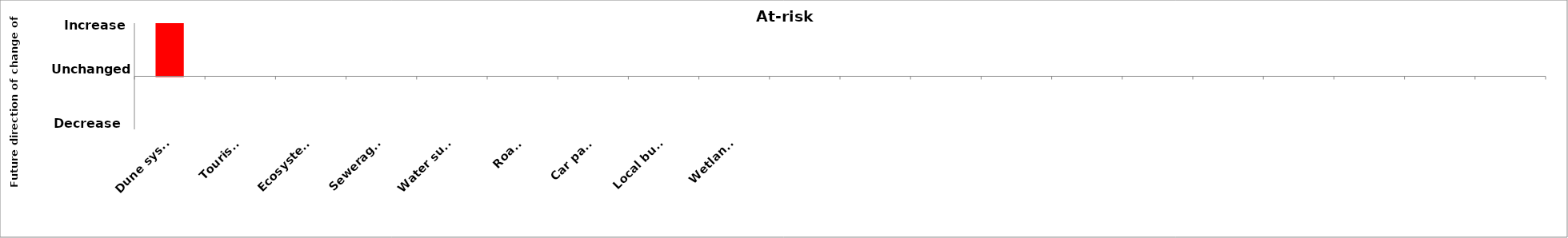
| Category | Future Direction |
|---|---|
| Dune system of X beach | 1 |
| Tourism  | 0 |
| Ecosystem | 0 |
| Sewerage pumps | 0 |
| Water supply infrastructure | 0 |
| Roads | 0 |
| Car park | 0 |
| Local businesses | 0 |
| Wetlands | 0 |